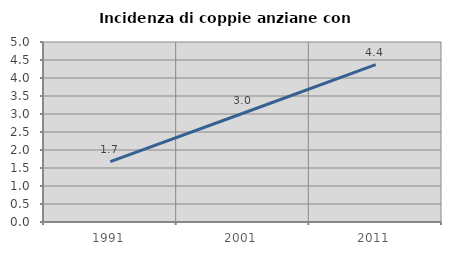
| Category | Incidenza di coppie anziane con figli |
|---|---|
| 1991.0 | 1.676 |
| 2001.0 | 3.021 |
| 2011.0 | 4.37 |